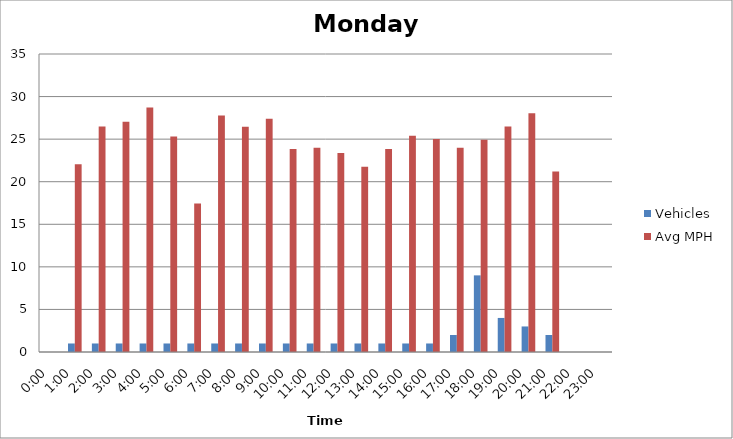
| Category | Vehicles | Avg MPH |
|---|---|---|
| 0:00 | 0 | 0 |
| 1:00 | 1 | 22.06 |
| 2:00 | 1 | 26.48 |
| 3:00 | 1 | 27.05 |
| 4:00 | 1 | 28.71 |
| 5:00 | 1 | 25.31 |
| 6:00 | 1 | 17.44 |
| 7:00 | 1 | 27.77 |
| 8:00 | 1 | 26.47 |
| 9:00 | 1 | 27.39 |
| 10:00 | 1 | 23.85 |
| 11:00 | 1 | 23.98 |
| 12:00 | 1 | 23.36 |
| 13:00 | 1 | 21.75 |
| 14:00 | 1 | 23.85 |
| 15:00 | 1 | 25.39 |
| 16:00 | 1 | 25.01 |
| 17:00 | 2 | 23.98 |
| 18:00 | 9 | 24.92 |
| 19:00 | 4 | 26.49 |
| 20:00 | 3 | 28.04 |
| 21:00 | 2 | 21.19 |
| 22:00 | 0 | 0 |
| 23:00 | 0 | 0 |